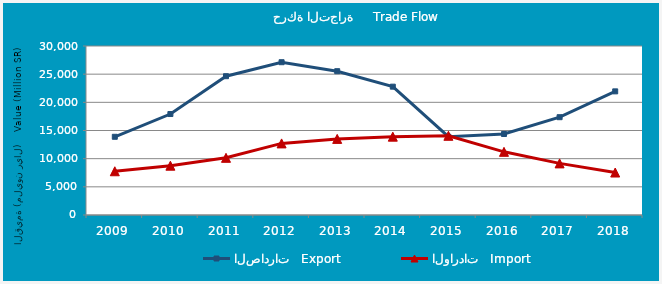
| Category | الصادرات   Export | الواردات   Import |
|---|---|---|
| 2009.0 | 13884423893 | 7764077175 |
| 2010.0 | 17924117520 | 8753333046 |
| 2011.0 | 24641185151 | 10149065325 |
| 2012.0 | 27123048072 | 12707459365 |
| 2013.0 | 25528343598 | 13507863954 |
| 2014.0 | 22781533173 | 13907017605 |
| 2015.0 | 13896373530 | 14059367280 |
| 2016.0 | 14379024219 | 11211236280 |
| 2017.0 | 17361733961 | 9161023870 |
| 2018.0 | 21946949540 | 7539966973 |